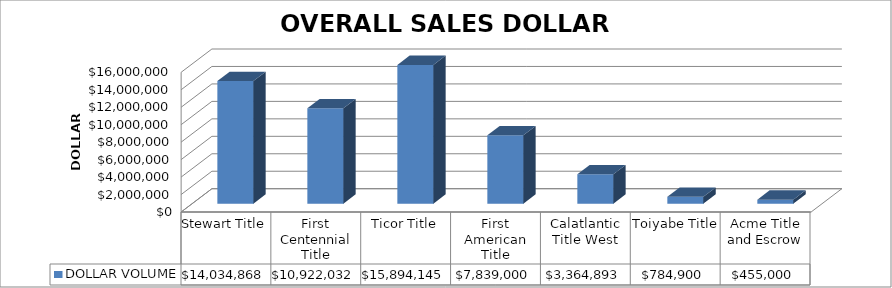
| Category | DOLLAR VOLUME |
|---|---|
| Stewart Title | 14034868 |
| First Centennial Title | 10922032 |
| Ticor Title | 15894145 |
| First American Title | 7839000 |
| Calatlantic Title West | 3364893 |
| Toiyabe Title | 784900 |
| Acme Title and Escrow | 455000 |